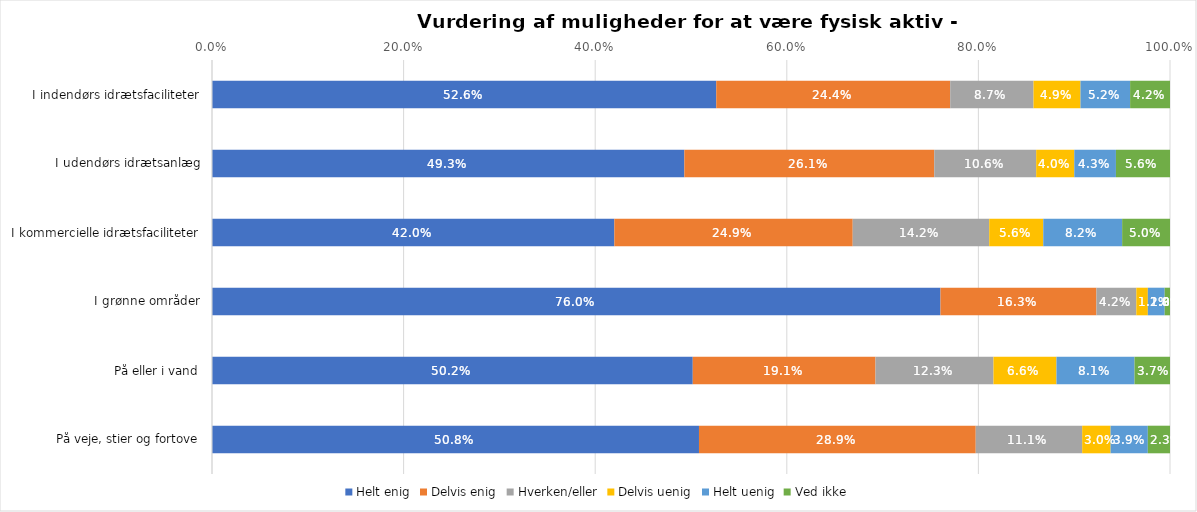
| Category | Helt enig | Delvis enig | Hverken/eller | Delvis uenig | Helt uenig | Ved ikke |
|---|---|---|---|---|---|---|
| I indendørs idrætsfaciliteter | 0.526 | 0.244 | 0.087 | 0.049 | 0.052 | 0.042 |
| I udendørs idrætsanlæg | 0.493 | 0.261 | 0.106 | 0.04 | 0.043 | 0.056 |
| I kommercielle idrætsfaciliteter | 0.42 | 0.249 | 0.142 | 0.056 | 0.082 | 0.05 |
| I grønne områder | 0.76 | 0.163 | 0.042 | 0.012 | 0.018 | 0.006 |
| På eller i vand | 0.502 | 0.191 | 0.123 | 0.066 | 0.081 | 0.037 |
| På veje, stier og fortove | 0.508 | 0.289 | 0.111 | 0.03 | 0.039 | 0.023 |